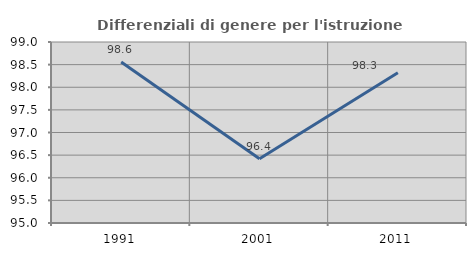
| Category | Differenziali di genere per l'istruzione superiore |
|---|---|
| 1991.0 | 98.556 |
| 2001.0 | 96.418 |
| 2011.0 | 98.322 |